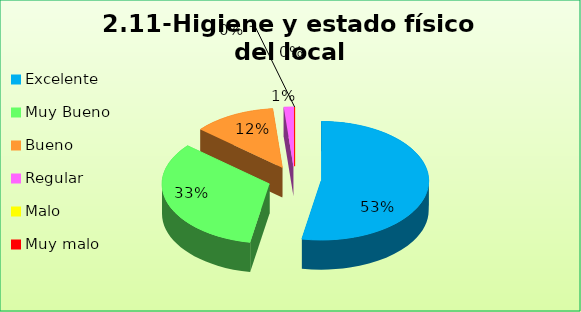
| Category | Series 0 |
|---|---|
| Excelente | 0.529 |
| Muy Bueno | 0.333 |
| Bueno  | 0.124 |
| Regular  | 0.014 |
| Malo  | 0 |
| Muy malo  | 0 |